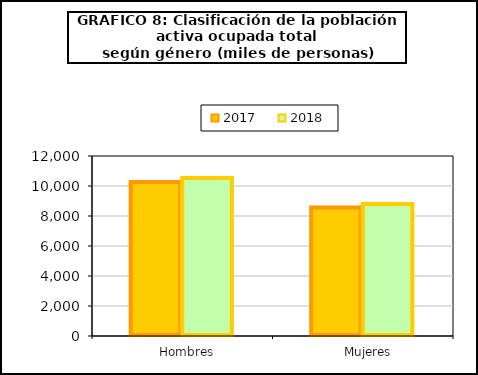
| Category | 2017 | 2018 |
|---|---|---|
|    Hombres | 10266.275 | 10531.95 |
|    Mujeres | 8558.5 | 8795.75 |